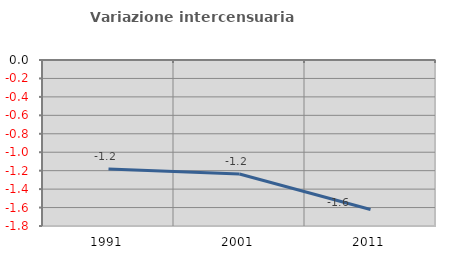
| Category | Variazione intercensuaria annua |
|---|---|
| 1991.0 | -1.183 |
| 2001.0 | -1.237 |
| 2011.0 | -1.62 |